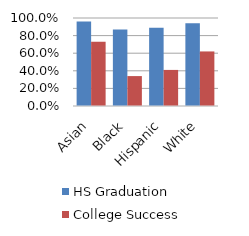
| Category | HS Graduation | College Success |
|---|---|---|
| Asian | 0.96 | 0.73 |
| Black | 0.87 | 0.34 |
| Hispanic | 0.89 | 0.41 |
| White | 0.94 | 0.62 |